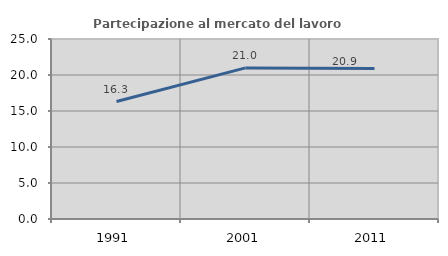
| Category | Partecipazione al mercato del lavoro  femminile |
|---|---|
| 1991.0 | 16.311 |
| 2001.0 | 20.984 |
| 2011.0 | 20.897 |